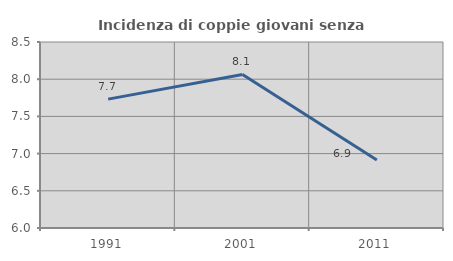
| Category | Incidenza di coppie giovani senza figli |
|---|---|
| 1991.0 | 7.732 |
| 2001.0 | 8.065 |
| 2011.0 | 6.913 |